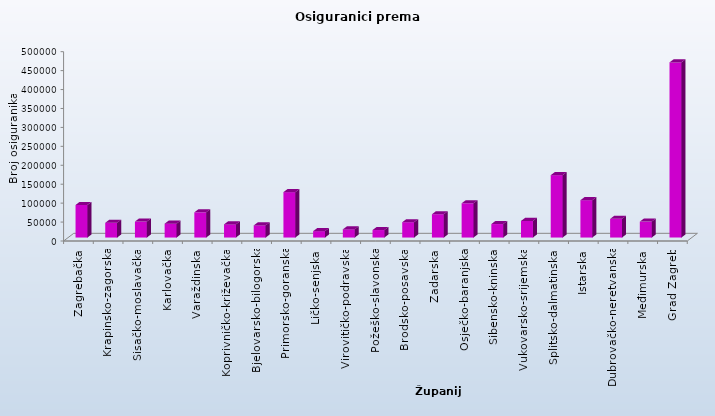
| Category | Series 0 |
|---|---|
| Zagrebačka | 86042 |
| Krapinsko-zagorska | 38997 |
| Sisačko-moslavačka | 42206 |
| Karlovačka | 36589 |
| Varaždinska | 66577 |
| Koprivničko-križevačka | 34729 |
| Bjelovarsko-bilogorska | 31985 |
| Primorsko-goranska | 119880 |
| Ličko-senjska | 16883 |
| Virovitičko-podravska | 21521 |
| Požeško-slavonska | 19798 |
| Brodsko-posavska | 40489 |
| Zadarska | 61543 |
| Osječko-baranjska | 90410 |
| Šibensko-kninska | 35602 |
| Vukovarsko-srijemska | 43831 |
| Splitsko-dalmatinska | 164730 |
| Istarska | 98667 |
| Dubrovačko-neretvanska | 49302 |
| Međimurska | 42106 |
| Grad Zagreb | 462566 |